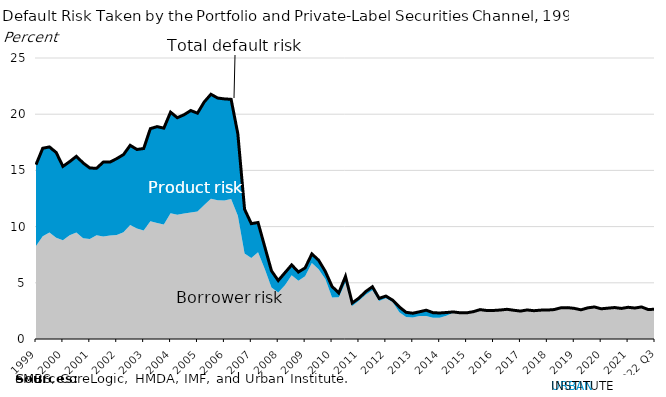
| Category | Series 2 |
|---|---|
| 1999 | 15.512 |
| 1999 | 16.97 |
| 2000 | 17.087 |
| 2000 | 16.594 |
| 2000 | 15.357 |
| 2000 | 15.779 |
| 2001 | 16.253 |
| 2001 | 15.664 |
| 2001 | 15.213 |
| 2001 | 15.188 |
| 2002 | 15.739 |
| 2002 | 15.743 |
| 2002 | 16.048 |
| 2002 | 16.404 |
| 2003 | 17.231 |
| 2003 | 16.863 |
| 2003 | 16.945 |
| 2003 | 18.715 |
| 2004 | 18.895 |
| 2004 | 18.759 |
| 2004 | 20.181 |
| 2004 | 19.687 |
| 2005 | 19.95 |
| 2005 | 20.327 |
| 2005 | 20.09 |
| 2005 | 21.088 |
| 2006 | 21.774 |
| 2006 | 21.437 |
| 2006 | 21.362 |
| 2006 | 21.321 |
| 2007 | 18.249 |
| 2007 | 11.542 |
| 2007 | 10.264 |
| 2007 | 10.363 |
| 2008 | 8.207 |
| 2008 | 6.064 |
| 2008 | 5.199 |
| 2008 | 5.897 |
| 2009 | 6.591 |
| 2009 | 5.958 |
| 2009 | 6.325 |
| 2009 | 7.568 |
| 2010 | 7.014 |
| 2010 | 6.017 |
| 2010 | 4.672 |
| 2010 | 4.096 |
| 2011 | 5.567 |
| 2011 | 3.208 |
| 2011 | 3.64 |
| 2011 | 4.221 |
| 2012 | 4.65 |
| 2012 | 3.613 |
| 2012 | 3.82 |
| 2012 | 3.459 |
| 2013 | 2.854 |
| 2013 | 2.375 |
| 2013 | 2.293 |
| 2013 | 2.422 |
| 2014 | 2.564 |
| 2014 | 2.342 |
| 2014 | 2.314 |
| 2014 | 2.357 |
| 2015 | 2.409 |
| 2015 | 2.335 |
| 2015 | 2.328 |
| 2015 | 2.432 |
| 2016 | 2.614 |
| 2016 | 2.535 |
| 2016 | 2.54 |
| 2016 | 2.578 |
| 2017 | 2.642 |
| 2017 | 2.558 |
| 2017 | 2.485 |
| 2017 | 2.584 |
| 2018 | 2.518 |
| 2018 | 2.568 |
| 2018 | 2.574 |
| 2018 | 2.618 |
| 2019 | 2.774 |
| 2019 | 2.791 |
| 2019 | 2.725 |
| 2019 | 2.597 |
| 2020 | 2.77 |
| 2020 | 2.851 |
| 2020 | 2.688 |
| 2020 | 2.744 |
| 2021 | 2.8 |
| 2021 | 2.721 |
| 2021 | 2.821 |
| 2021 | 2.756 |
| 2022 Q1 | 2.851 |
| 2022 Q2 | 2.619 |
| 2022 Q3 | 2.65 |